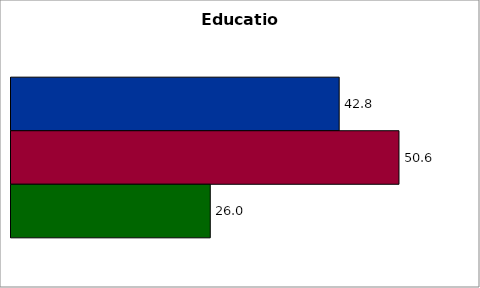
| Category | 50 states and D.C. | SREB states | State |
|---|---|---|---|
| 0 | 42.806 | 50.606 | 25.991 |